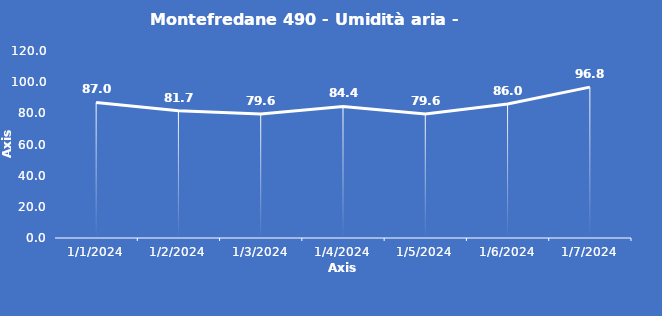
| Category | Montefredane 490 - Umidità aria - Grezzo (%) |
|---|---|
| 1/1/24 | 87 |
| 1/2/24 | 81.7 |
| 1/3/24 | 79.6 |
| 1/4/24 | 84.4 |
| 1/5/24 | 79.6 |
| 1/6/24 | 86 |
| 1/7/24 | 96.8 |